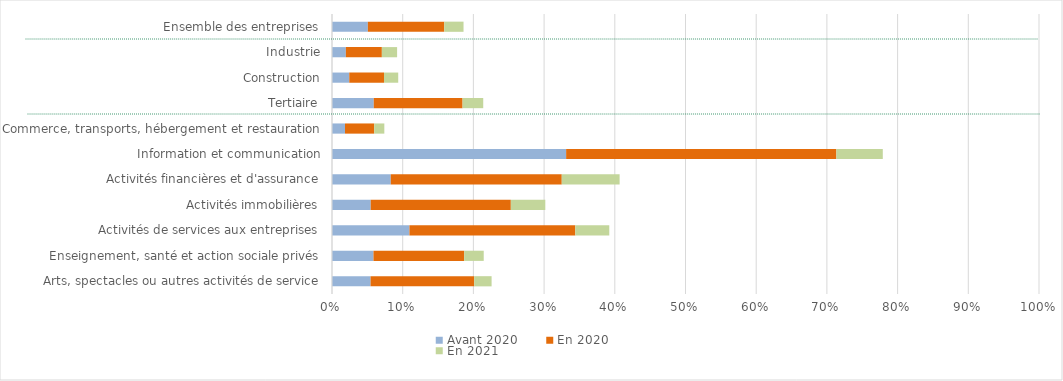
| Category | Avant 2020 | En 2020 | En 2021 |
|---|---|---|---|
| Arts, spectacles ou autres activités de service | 0.055 | 0.147 | 0.025 |
| Enseignement, santé et action sociale privés | 0.059 | 0.128 | 0.028 |
| Activités de services aux entreprises | 0.11 | 0.235 | 0.048 |
| Activités immobilières | 0.055 | 0.198 | 0.049 |
| Activités financières et d'assurance | 0.083 | 0.242 | 0.082 |
| Information et communication | 0.331 | 0.382 | 0.066 |
| Commerce, transports, hébergement et restauration | 0.018 | 0.041 | 0.014 |
| Tertiaire | 0.059 | 0.126 | 0.029 |
| Construction | 0.024 | 0.049 | 0.02 |
| Industrie | 0.02 | 0.051 | 0.022 |
| Ensemble des entreprises | 0.051 | 0.108 | 0.027 |